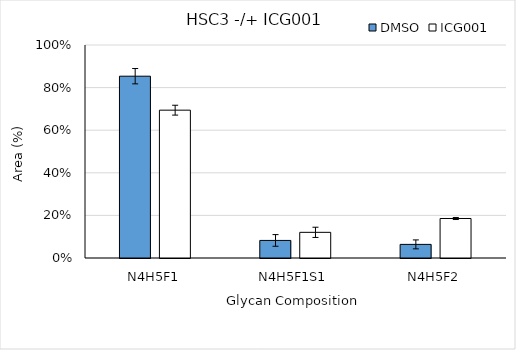
| Category | DMSO | ICG001 |
|---|---|---|
| N4H5F1 | 0.854 | 0.694 |
| N4H5F1S1 | 0.082 | 0.12 |
| N4H5F2 | 0.064 | 0.185 |